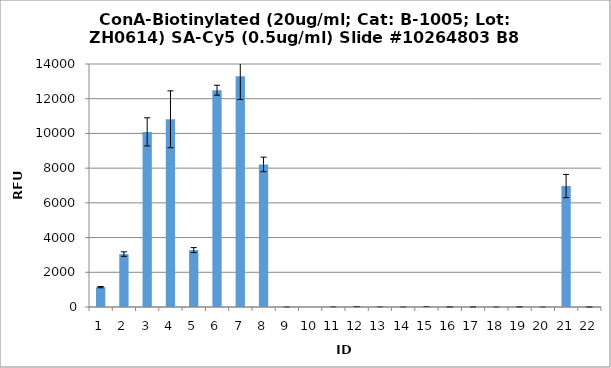
| Category | Series 0 |
|---|---|
| 0 | 1144 |
| 1 | 3047.25 |
| 2 | 10089.5 |
| 3 | 10815 |
| 4 | 3278.25 |
| 5 | 12490 |
| 6 | 13300.25 |
| 7 | 8212.25 |
| 8 | 0.75 |
| 9 | -1.25 |
| 10 | 4.5 |
| 11 | 24.25 |
| 12 | 3 |
| 13 | 0.25 |
| 14 | 9.5 |
| 15 | 2.25 |
| 16 | 2.75 |
| 17 | 1.5 |
| 18 | 6.5 |
| 19 | 1.75 |
| 20 | 6968.5 |
| 21 | -0.5 |